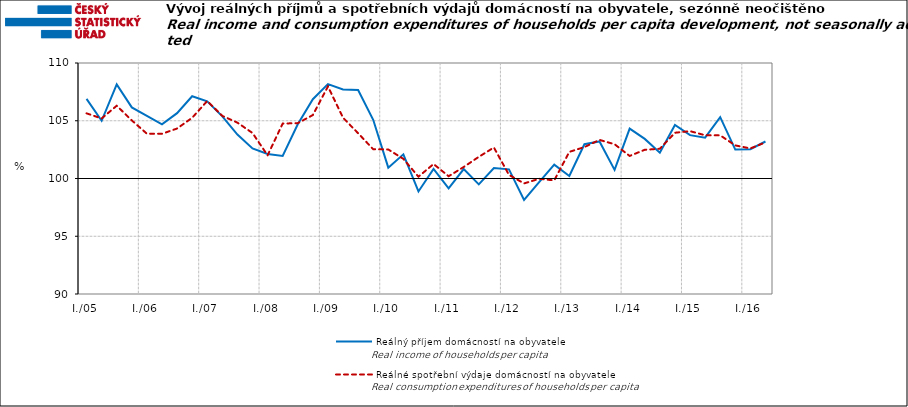
| Category | Reálný příjem domácností na obyvatele | Reálné spotřební výdaje domácností na obyvatele |
|---|---|---|
| I./05 | 106.898 | 105.642 |
|  | 104.998 | 105.199 |
|  | 108.15 | 106.3 |
|  | 106.155 | 105.031 |
| I./06 | 105.431 | 103.879 |
|  | 104.685 | 103.87 |
|  | 105.658 | 104.326 |
|  | 107.121 | 105.256 |
| I./07 | 106.684 | 106.711 |
|  | 105.383 | 105.42 |
|  | 103.807 | 104.837 |
|  | 102.598 | 103.939 |
| I./08 | 102.123 | 102.003 |
|  | 101.955 | 104.757 |
|  | 104.7 | 104.794 |
|  | 106.862 | 105.492 |
| I./09 | 108.173 | 107.97 |
|  | 107.713 | 105.261 |
|  | 107.657 | 103.919 |
|  | 105.084 | 102.535 |
| I./10 | 100.941 | 102.513 |
|  | 102.091 | 101.699 |
|  | 98.879 | 100.155 |
|  | 100.825 | 101.253 |
| I./11 | 99.141 | 100.195 |
|  | 100.817 | 100.995 |
|  | 99.488 | 101.876 |
|  | 100.901 | 102.682 |
| I./12 | 100.794 | 100.316 |
|  | 98.144 | 99.573 |
|  | 99.679 | 99.975 |
|  | 101.203 | 99.837 |
| I./13 | 100.22 | 102.304 |
|  | 102.967 | 102.721 |
|  | 103.21 | 103.342 |
|  | 100.746 | 102.966 |
| I./14 | 104.315 | 101.952 |
|  | 103.429 | 102.488 |
|  | 102.237 | 102.572 |
|  | 104.631 | 103.961 |
| I./15 | 103.755 | 104.1 |
|  | 103.538 | 103.744 |
|  | 105.317 | 103.739 |
|  | 102.506 | 102.864 |
| I./16 | 102.533 | 102.604 |